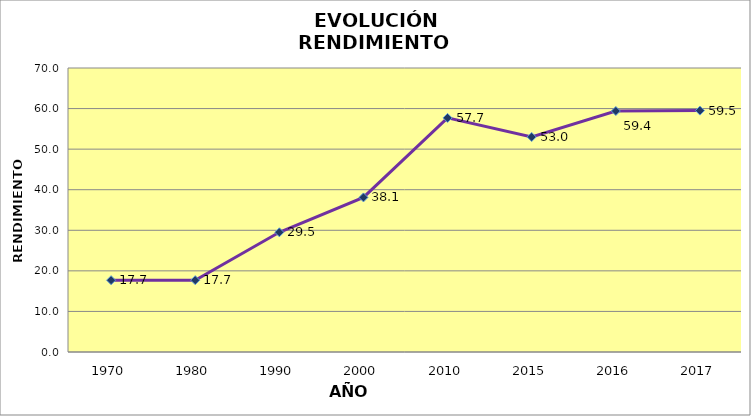
| Category | Rendimiento (qq/ha) |
|---|---|
| 1970.0 | 17.7 |
| 1980.0 | 17.7 |
| 1990.0 | 29.5 |
| 2000.0 | 38.1 |
| 2010.0 | 57.7 |
| 2015.0 | 53 |
| 2016.0 | 59.4 |
| 2017.0 | 59.5 |